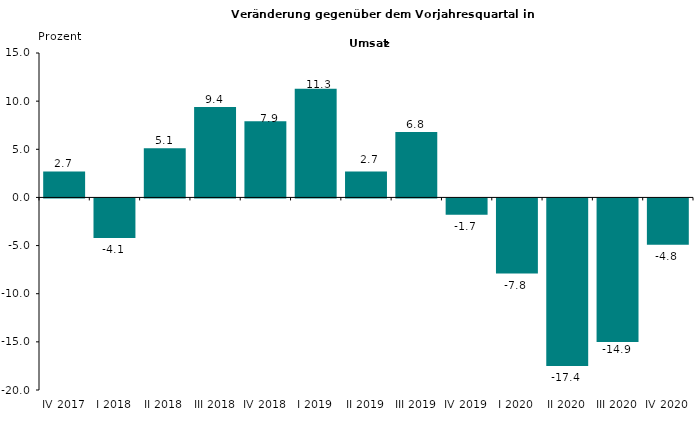
| Category | 2,7 |
|---|---|
| IV 2017 | 2.7 |
| I 2018 | -4.1 |
| II 2018 | 5.1 |
| III 2018 | 9.4 |
| IV 2018 | 7.9 |
| I 2019 | 11.3 |
| II 2019 | 2.7 |
| III 2019 | 6.8 |
| IV 2019 | -1.7 |
| I 2020 | -7.8 |
| II 2020 | -17.4 |
| III 2020 | -14.9 |
| IV 2020 | -4.8 |